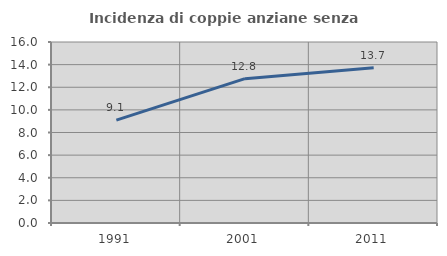
| Category | Incidenza di coppie anziane senza figli  |
|---|---|
| 1991.0 | 9.091 |
| 2001.0 | 12.76 |
| 2011.0 | 13.731 |